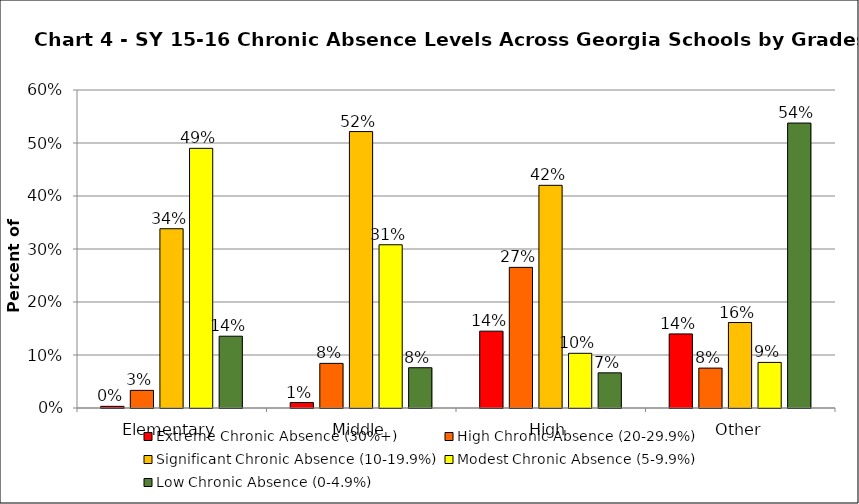
| Category | Extreme Chronic Absence (30%+) | High Chronic Absence (20-29.9%) | Significant Chronic Absence (10-19.9%) | Modest Chronic Absence (5-9.9%) | Low Chronic Absence (0-4.9%) |
|---|---|---|---|---|---|
| 0 | 0.003 | 0.033 | 0.338 | 0.49 | 0.135 |
| 1 | 0.01 | 0.084 | 0.522 | 0.308 | 0.076 |
| 2 | 0.145 | 0.265 | 0.42 | 0.103 | 0.066 |
| 3 | 0.14 | 0.075 | 0.161 | 0.086 | 0.538 |